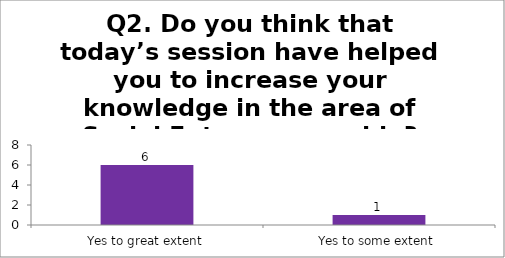
| Category | Q2. Do you think that today’s session have helped you to increase your knowledge in the area of Social Entrepreneurship? |
|---|---|
| Yes to great extent | 6 |
| Yes to some extent | 1 |